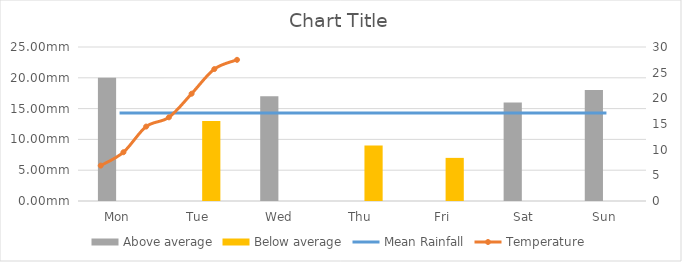
| Category | Above average | Below average |
|---|---|---|
| Mon | 1900-01-20 | 0 |
| Tue | 0 | 1900-01-13 |
| Wed | 1900-01-17 | 0 |
| Thu | 0 | 1900-01-09 |
| Fri | 0 | 1900-01-07 |
| Sat | 1900-01-16 | 0 |
| Sun | 1900-01-18 | 0 |